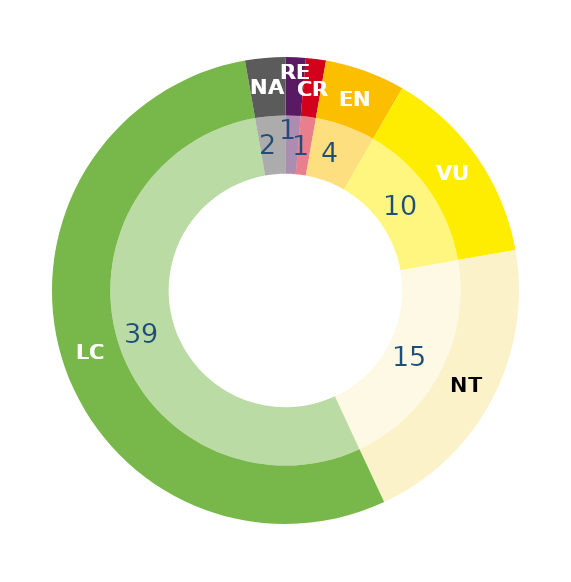
| Category | Series 1 | Series 0 |
|---|---|---|
| RE | 1 | 1 |
| CR | 1 | 1 |
| EN | 4 | 4 |
| VU | 10 | 10 |
| NT | 15 | 15 |
| LC | 39 | 39 |
| DD | 0 | 0 |
| NA | 2 | 2 |